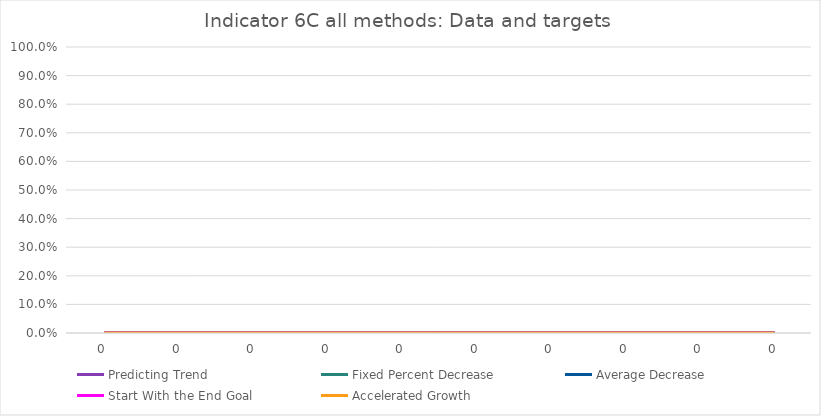
| Category | Predicting Trend | Fixed Percent Decrease | Average Decrease | Start With the End Goal | Accelerated Growth |
|---|---|---|---|---|---|
| 0.0 | 0 | 0 | 0 | 0 | 0 |
| 0.0 | 0 | 0 | 0 | 0 | 0 |
| 0.0 | 0 | 0 | 0 | 0 | 0 |
| 0.0 | 0 | 0 | 0 | 0 | 0 |
| 0.0 | 0 | 0 | 0 | 0 | 0 |
| 0.0 | 0 | 0 | 0 | 0 | 0 |
| 0.0 | 0 | 0 | 0 | 0 | 0 |
| 0.0 | 0 | 0 | 0 | 0 | 0 |
| 0.0 | 0 | 0 | 0 | 0 | 0 |
| 0.0 | 0 | 0 | 0 | 0 | 0 |